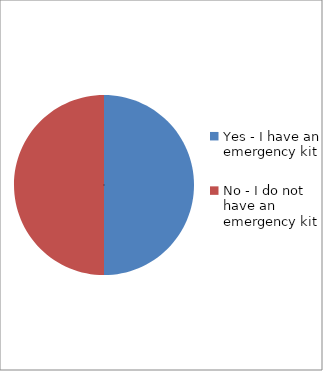
| Category | Series 0 |
|---|---|
| Yes - I have an emergency kit | 0.5 |
| No - I do not have an emergency kit | 0.5 |